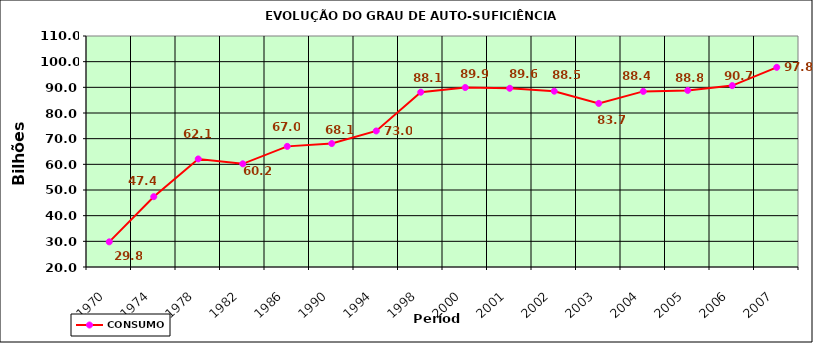
| Category | CONSUMO |
|---|---|
| 1970.0 | 29.8 |
| 1974.0 | 47.4 |
| 1978.0 | 62.1 |
| 1982.0 | 60.2 |
| 1986.0 | 67 |
| 1990.0 | 68.1 |
| 1994.0 | 73 |
| 1998.0 | 88.1 |
| 2000.0 | 89.93 |
| 2001.0 | 89.625 |
| 2002.0 | 88.497 |
| 2003.0 | 83.734 |
| 2004.0 | 88.42 |
| 2005.0 | 88.807 |
| 2006.0 | 90.673 |
| 2007.0 | 97.786 |